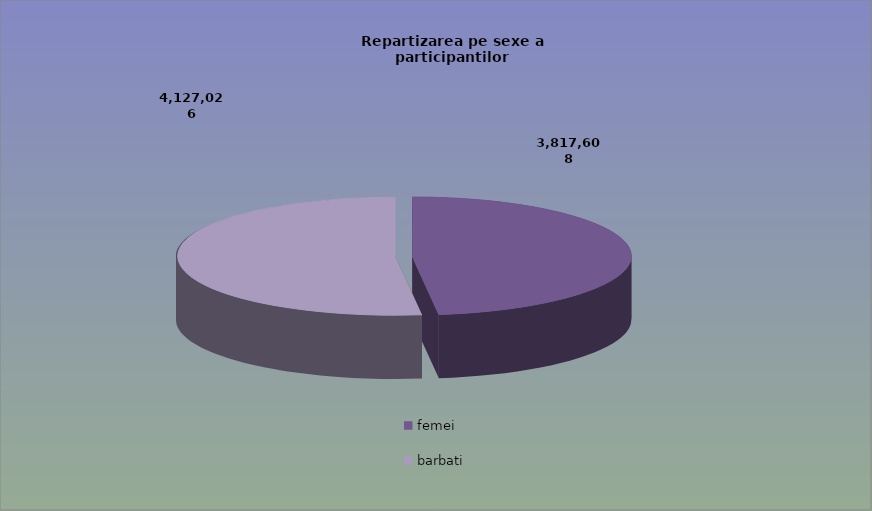
| Category | Series 0 |
|---|---|
| femei | 3817608 |
| barbati | 4127026 |